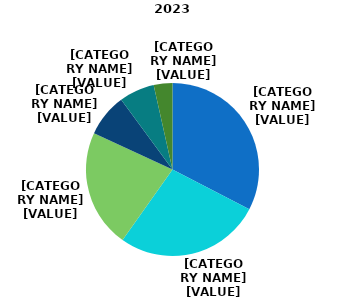
| Category | 2023 |
|---|---|
| 60-64 ani | 0.326 |
| 65-69 ani | 0.272 |
| 70-74 ani | 0.221 |
| 75-79 ani | 0.08 |
| 80-84 ani | 0.066 |
| 85 ani şi peste | 0.035 |